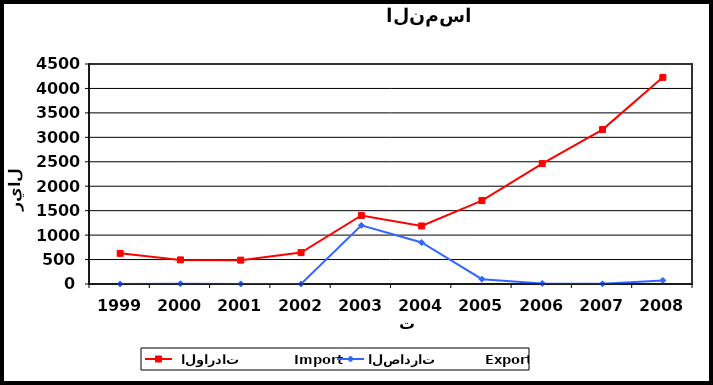
| Category |  الواردات           Import | الصادرات          Export |
|---|---|---|
| 1999.0 | 627 | 1 |
| 2000.0 | 493 | 5 |
| 2001.0 | 488 | 2 |
| 2002.0 | 642 | 1 |
| 2003.0 | 1402 | 1199 |
| 2004.0 | 1187 | 849 |
| 2005.0 | 1707 | 98 |
| 2006.0 | 2463 | 11 |
| 2007.0 | 3159 | 4 |
| 2008.0 | 4227 | 73 |